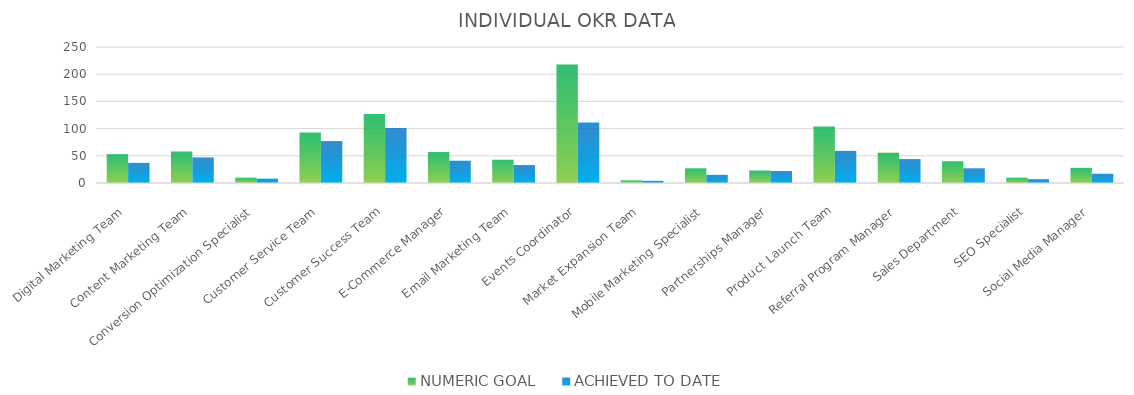
| Category | NUMERIC GOAL | ACHIEVED TO DATE |
|---|---|---|
| Digital Marketing Team | 53 | 37 |
| Content Marketing Team | 58 | 47 |
| Conversion Optimization Specialist | 10 | 8 |
| Customer Service Team | 93 | 77 |
| Customer Success Team | 127 | 101 |
| E-Commerce Manager | 57 | 41 |
| Email Marketing Team | 43 | 33 |
| Events Coordinator | 218 | 111 |
| Market Expansion Team | 5 | 4 |
| Mobile Marketing Specialist | 27 | 15 |
| Partnerships Manager | 23 | 22 |
| Product Launch Team | 104 | 59 |
| Referral Program Manager | 56 | 44 |
| Sales Department | 40 | 27 |
| SEO Specialist | 10 | 7 |
| Social Media Manager | 28 | 17 |